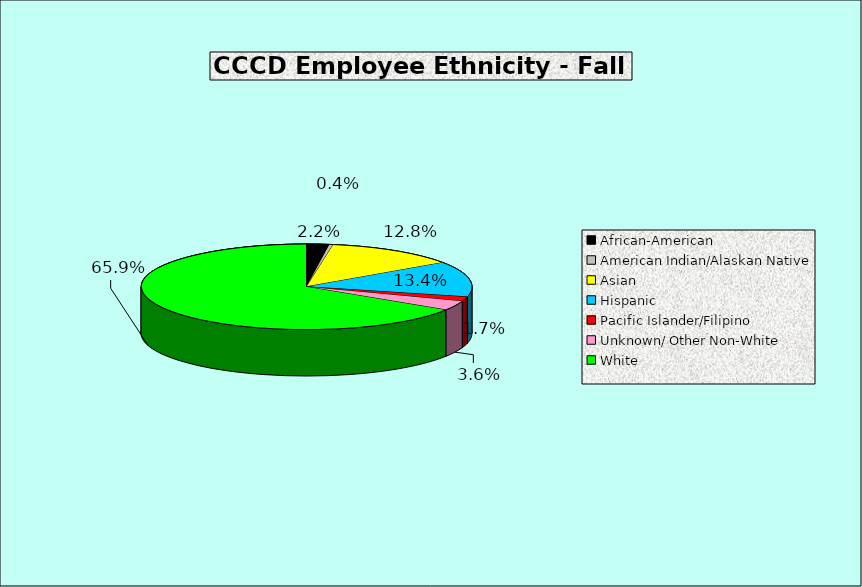
| Category | Series 0 |
|---|---|
| African-American | 0.022 |
| American Indian/Alaskan Native | 0.004 |
| Asian | 0.128 |
| Hispanic | 0.134 |
| Pacific Islander/Filipino | 0.017 |
| Unknown/ Other Non-White | 0.036 |
| White | 0.659 |